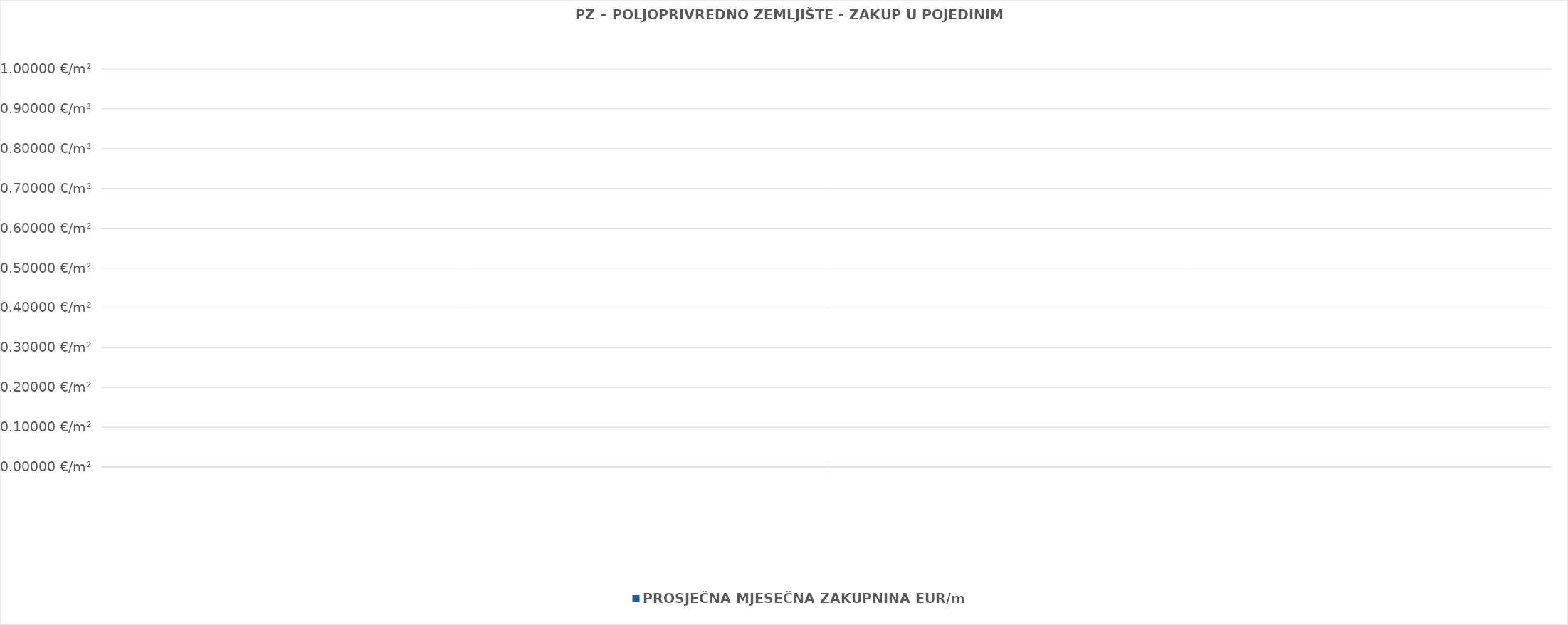
| Category | PROSJEČNA MJESEČNA ZAKUPNINA EUR/m² |
|---|---|
| 0 | 0 |
| 1 | 0 |